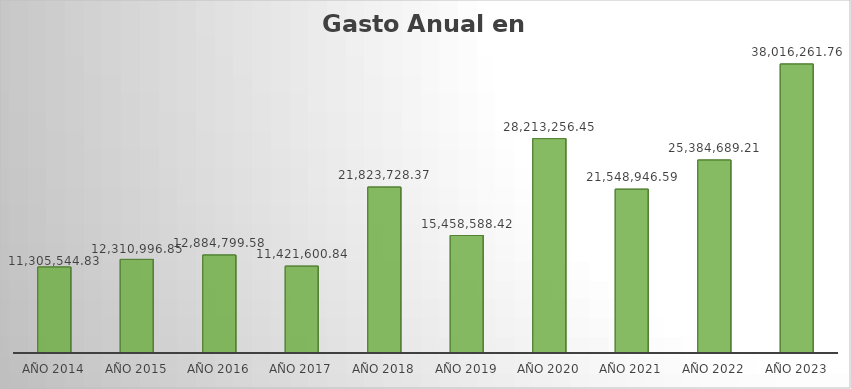
| Category | Monto |
|---|---|
| AÑO 2014 | 11305544.83 |
| AÑO 2015 | 12310996.85 |
| AÑO 2016 | 12884799.58 |
| AÑO 2017 | 11421600.84 |
| AÑO 2018 | 21823728.37 |
| AÑO 2019 | 15458588.42 |
| AÑO 2020 | 28213256.45 |
| AÑO 2021 | 21548946.59 |
| AÑO 2022 | 25384689.21 |
| AÑO 2023 | 38016261.76 |